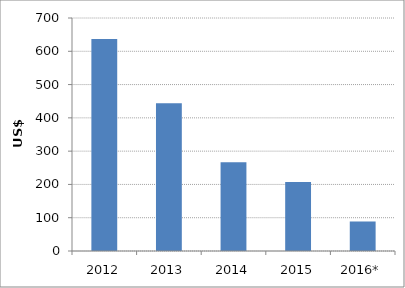
| Category | US$ millions |
|---|---|
| 2012 | 636.689 |
| 2013 | 443.736 |
| 2014 | 266.302 |
| 2015 | 207.369 |
| 2016* | 88.666 |